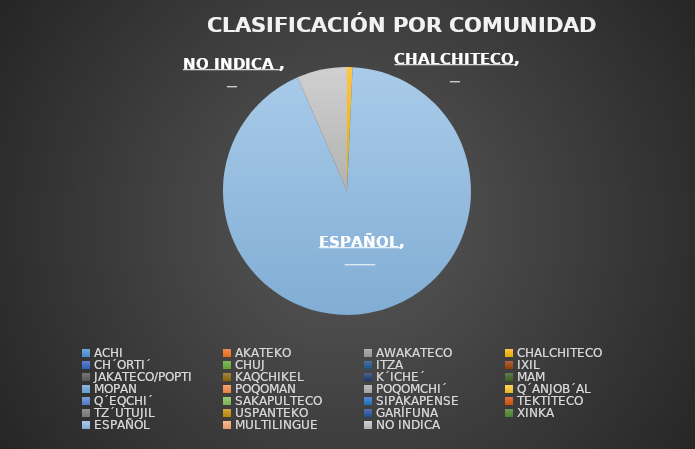
| Category | Series 0 |
|---|---|
| ACHI | 0 |
| AKATEKO | 0 |
| AWAKATECO | 0 |
| CHALCHITECO | 1 |
| CH´ORTI´ | 0 |
| CHUJ | 0 |
| ITZA | 0 |
| IXIL | 0 |
| JAKATECO/POPTI | 0 |
| KAQCHIKEL | 0 |
| K´ICHE´ | 0 |
| MAM | 0 |
| MOPAN | 0 |
| POQOMAN | 0 |
| POQOMCHI´ | 0 |
| Q´ANJOB´AL | 0 |
| Q´EQCHI´ | 0 |
| SAKAPULTECO | 0 |
| SIPAKAPENSE | 0 |
| TEKTITECO | 0 |
| TZ´UTUJIL | 0 |
| USPANTEKO | 0 |
| GARÍFUNA | 0 |
| XINKA | 0 |
| ESPAÑOL | 128 |
| MULTILINGUE | 0 |
| NO INDICA  | 9 |